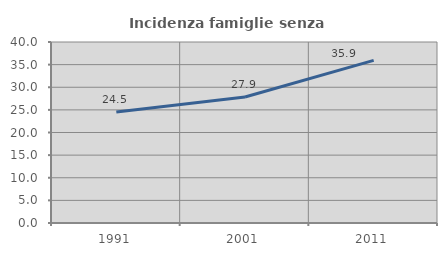
| Category | Incidenza famiglie senza nuclei |
|---|---|
| 1991.0 | 24.538 |
| 2001.0 | 27.853 |
| 2011.0 | 35.936 |